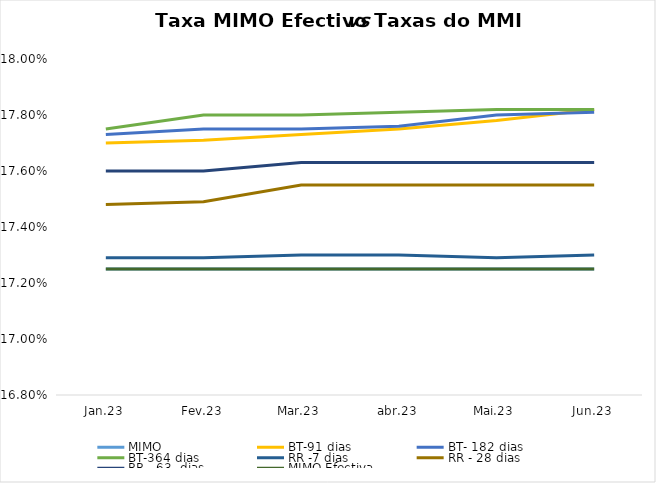
| Category | MIMO | BT-91 dias | BT- 182 dias | BT-364 dias | RR -7 dias | RR - 28 dias | RR - 63  dias | MIMO Efectiva |
|---|---|---|---|---|---|---|---|---|
| Jan.23 | 0.172 | 0.177 | 0.177 | 0.178 | 0.173 | 0.175 | 0.176 | 0.172 |
| Fev.23 | 0.172 | 0.177 | 0.178 | 0.178 | 0.173 | 0.175 | 0.176 | 0.172 |
| Mar.23 | 0.172 | 0.177 | 0.178 | 0.178 | 0.173 | 0.176 | 0.176 | 0.172 |
| abr.23 | 0.172 | 0.178 | 0.178 | 0.178 | 0.173 | 0.176 | 0.176 | 0.172 |
| Mai.23 | 0.172 | 0.178 | 0.178 | 0.178 | 0.173 | 0.176 | 0.176 | 0.172 |
| Jun.23 | 0.172 | 0.178 | 0.178 | 0.178 | 0.173 | 0.176 | 0.176 | 0.172 |